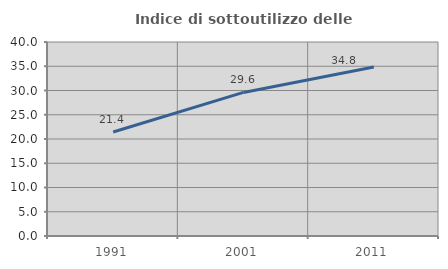
| Category | Indice di sottoutilizzo delle abitazioni  |
|---|---|
| 1991.0 | 21.442 |
| 2001.0 | 29.606 |
| 2011.0 | 34.827 |